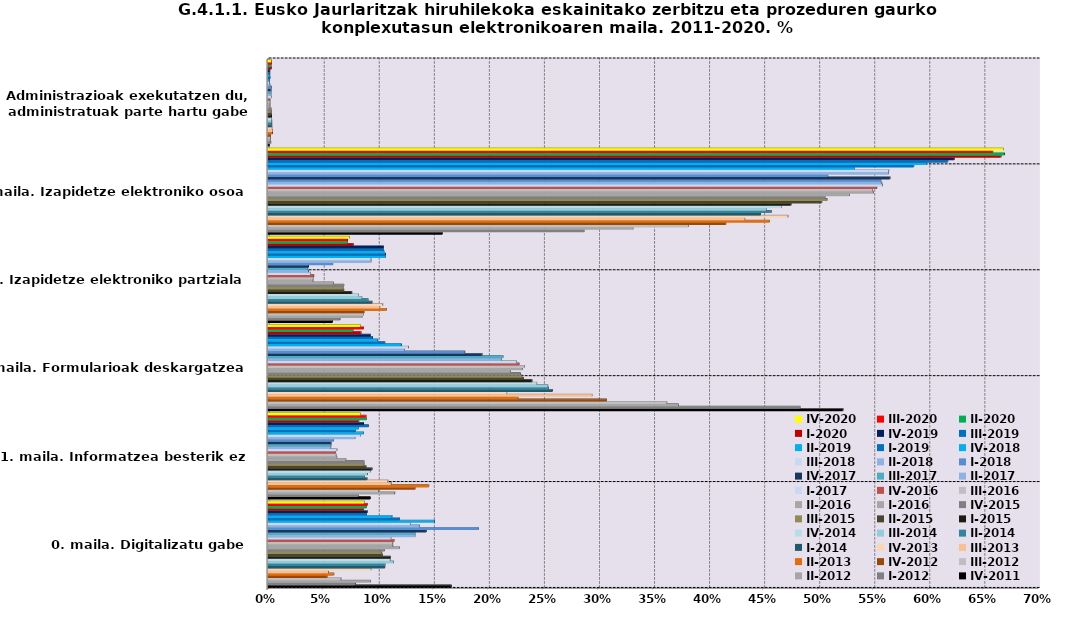
| Category | IV-2011 | I-2012 | II-2012 | III-2012 | IV-2012 | II-2013 | III-2013 | IV-2013 | I-2014 | II-2014 | III-2014 | IV-2014 | I-2015 | II-2015 | III-2015 | IV-2015 | I-2016 | II-2016 | III-2016 | IV-2016 | I-2017 | II-2017 | III-2017 | IV-2017 | I-2018 | II-2018 | III-2018 | IV-2018 | I-2019 | II-2019 | III-2019 | IV-2019 | I-2020 | II-2020 | III-2020 | IV-2020 |
|---|---|---|---|---|---|---|---|---|---|---|---|---|---|---|---|---|---|---|---|---|---|---|---|---|---|---|---|---|---|---|---|---|---|---|---|---|
|  0. maila. Digitalizatu gabe | 0.166 | 0.079 | 0.093 | 0.066 | 0.054 | 0.06 | 0.055 | 0.094 | 0.106 | 0.106 | 0.114 | 0.111 | 0.111 | 0.104 | 0.103 | 0.106 | 0.119 | 0.113 | 0.113 | 0.115 | 0.112 | 0.134 | 0.134 | 0.144 | 0.191 | 0.138 | 0.13 | 0.151 | 0.12 | 0.113 | 0.09 | 0.09 | 0.087 | 0.089 | 0.09 | 0.087 |
| 1. maila. Informatzea besterik ez | 0.093 | 0.082 | 0.115 | 0.101 | 0.134 | 0.146 | 0.112 | 0.109 | 0.09 | 0.087 | 0.09 | 0.093 | 0.095 | 0.089 | 0.087 | 0.087 | 0.071 | 0.063 | 0.062 | 0.061 | 0.063 | 0.057 | 0.057 | 0.057 | 0.06 | 0.079 | 0.084 | 0.087 | 0.079 | 0.082 | 0.091 | 0.087 | 0.083 | 0.089 | 0.089 | 0.084 |
| 2. maila. Formularioak deskargatzea | 0.522 | 0.483 | 0.373 | 0.362 | 0.307 | 0.227 | 0.294 | 0.217 | 0.258 | 0.255 | 0.254 | 0.244 | 0.24 | 0.232 | 0.231 | 0.229 | 0.22 | 0.231 | 0.233 | 0.228 | 0.226 | 0.212 | 0.213 | 0.194 | 0.179 | 0.124 | 0.128 | 0.121 | 0.106 | 0.1 | 0.095 | 0.093 | 0.085 | 0.077 | 0.087 | 0.084 |
| 3. maila. Izapidetze elektroniko partziala | 0.059 | 0.065 | 0.086 | 0.087 | 0.087 | 0.108 | 0.102 | 0.104 | 0.094 | 0.091 | 0.085 | 0.082 | 0.076 | 0.069 | 0.068 | 0.069 | 0.059 | 0.041 | 0.041 | 0.042 | 0.039 | 0.037 | 0.036 | 0.037 | 0.059 | 0.094 | 0.094 | 0.107 | 0.107 | 0.106 | 0.105 | 0.105 | 0.077 | 0.072 | 0.072 | 0.074 |
| 4. maila. Izapidetze elektroniko osoa | 0.158 | 0.287 | 0.332 | 0.382 | 0.416 | 0.455 | 0.433 | 0.472 | 0.447 | 0.457 | 0.453 | 0.466 | 0.475 | 0.503 | 0.508 | 0.506 | 0.528 | 0.55 | 0.549 | 0.553 | 0.558 | 0.557 | 0.557 | 0.565 | 0.509 | 0.564 | 0.564 | 0.532 | 0.587 | 0.598 | 0.617 | 0.623 | 0.666 | 0.669 | 0.658 | 0.668 |
| 5. maila. Administrazioak exekutatzen du, administratuak parte hartu gabe | 0.001 | 0.003 | 0.002 | 0.002 | 0.002 | 0.004 | 0.004 | 0.004 | 0.004 | 0.003 | 0.003 | 0.003 | 0.003 | 0.003 | 0.003 | 0.003 | 0.002 | 0.002 | 0.002 | 0.002 | 0.003 | 0.003 | 0.003 | 0.003 | 0.003 | 0.002 | 0.001 | 0.001 | 0.002 | 0.002 | 0.002 | 0.002 | 0.003 | 0.003 | 0.003 | 0.003 |